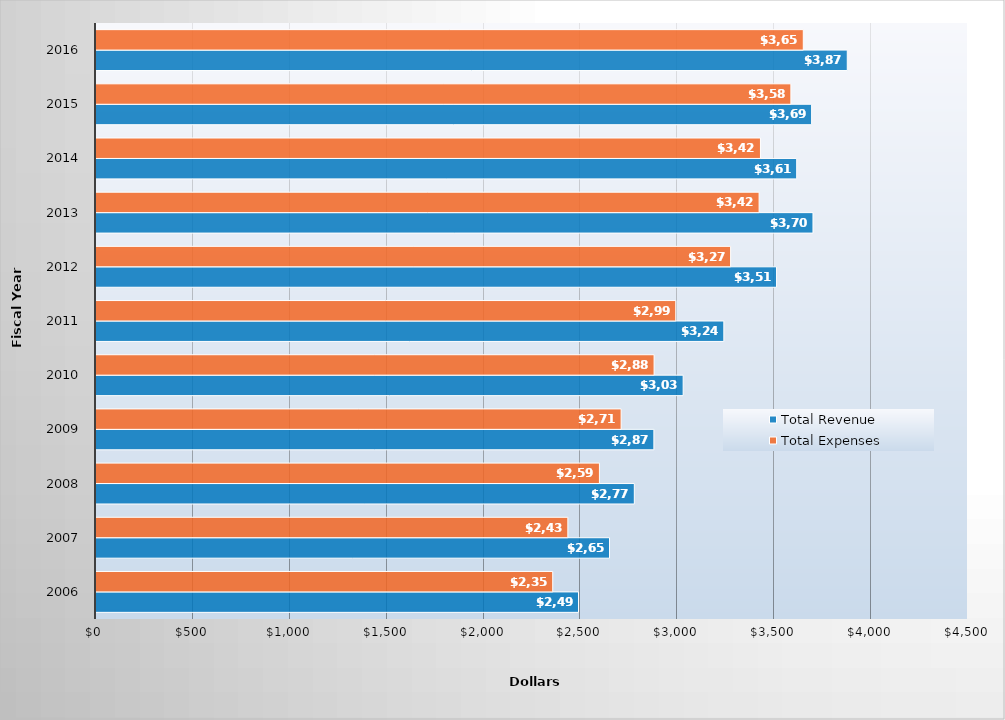
| Category | Total Revenue | Total Expenses |
|---|---|---|
| 2006.0 | 2490 | 2357 |
| 2007.0 | 2650 | 2435 |
| 2008.0 | 2778 | 2598 |
| 2009.0 | 2879 | 2710 |
| 2010.0 | 3030 | 2880 |
| 2011.0 | 3240 | 2992 |
| 2012.0 | 3512 | 3275 |
| 2013.0 | 3700 | 3422 |
| 2014.0 | 3616 | 3429 |
| 2015.0 | 3693 | 3586 |
| 2016.0 | 3877 | 3650 |